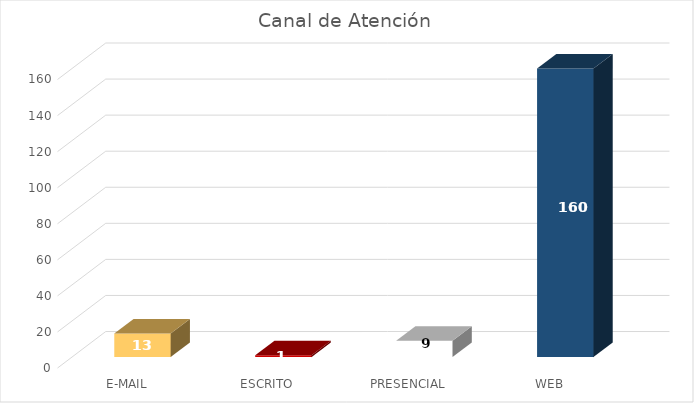
| Category | Series1 |
|---|---|
| E-MAIL | 13 |
| ESCRITO | 1 |
| PRESENCIAL | 9 |
| WEB | 160 |